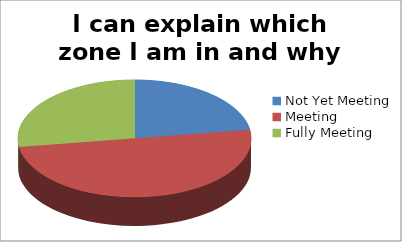
| Category | I can explain which zone I am in and why |
|---|---|
| Not Yet Meeting | 19 |
| Meeting | 42 |
| Fully Meeting | 23 |